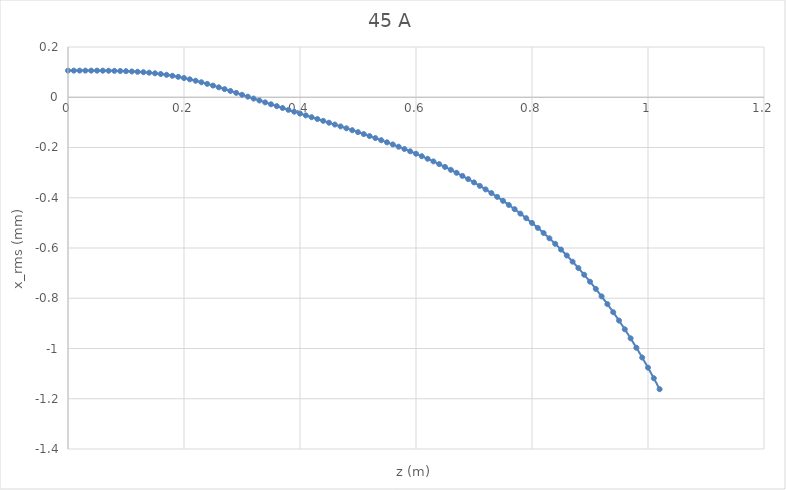
| Category | Series 0 |
|---|---|
| 0.0 | 0.106 |
| 0.01 | 0.106 |
| 0.02 | 0.106 |
| 0.03 | 0.106 |
| 0.04 | 0.106 |
| 0.05 | 0.106 |
| 0.06 | 0.106 |
| 0.07 | 0.105 |
| 0.08 | 0.105 |
| 0.09 | 0.104 |
| 0.1 | 0.104 |
| 0.11 | 0.103 |
| 0.12 | 0.101 |
| 0.13 | 0.1 |
| 0.14 | 0.098 |
| 0.15 | 0.095 |
| 0.16 | 0.093 |
| 0.17 | 0.089 |
| 0.18 | 0.085 |
| 0.19 | 0.081 |
| 0.2 | 0.077 |
| 0.21 | 0.071 |
| 0.22 | 0.066 |
| 0.23 | 0.06 |
| 0.24 | 0.053 |
| 0.25 | 0.047 |
| 0.26 | 0.04 |
| 0.27 | 0.032 |
| 0.28 | 0.025 |
| 0.29 | 0.017 |
| 0.3 | 0.01 |
| 0.31 | 0.002 |
| 0.32 | -0.005 |
| 0.33 | -0.013 |
| 0.34 | -0.02 |
| 0.35 | -0.028 |
| 0.36 | -0.035 |
| 0.37 | -0.043 |
| 0.38 | -0.05 |
| 0.39 | -0.058 |
| 0.4 | -0.065 |
| 0.41 | -0.072 |
| 0.42 | -0.079 |
| 0.43 | -0.087 |
| 0.44 | -0.094 |
| 0.45 | -0.101 |
| 0.46 | -0.109 |
| 0.47 | -0.116 |
| 0.48 | -0.124 |
| 0.49 | -0.131 |
| 0.5 | -0.139 |
| 0.51 | -0.147 |
| 0.52 | -0.155 |
| 0.53 | -0.163 |
| 0.54 | -0.171 |
| 0.55 | -0.179 |
| 0.56 | -0.188 |
| 0.57 | -0.197 |
| 0.58 | -0.206 |
| 0.59 | -0.215 |
| 0.6 | -0.225 |
| 0.61 | -0.235 |
| 0.62 | -0.245 |
| 0.63 | -0.255 |
| 0.64 | -0.266 |
| 0.65 | -0.277 |
| 0.66 | -0.289 |
| 0.67 | -0.301 |
| 0.68 | -0.313 |
| 0.69 | -0.326 |
| 0.7 | -0.339 |
| 0.71 | -0.353 |
| 0.72 | -0.367 |
| 0.73 | -0.381 |
| 0.74 | -0.397 |
| 0.75 | -0.412 |
| 0.76 | -0.429 |
| 0.77 | -0.446 |
| 0.78 | -0.463 |
| 0.79 | -0.481 |
| 0.8 | -0.5 |
| 0.81 | -0.52 |
| 0.82 | -0.54 |
| 0.83 | -0.561 |
| 0.84 | -0.583 |
| 0.85 | -0.606 |
| 0.86 | -0.63 |
| 0.87 | -0.654 |
| 0.88 | -0.68 |
| 0.89 | -0.707 |
| 0.9 | -0.734 |
| 0.91 | -0.763 |
| 0.92 | -0.792 |
| 0.93 | -0.823 |
| 0.94 | -0.855 |
| 0.95 | -0.889 |
| 0.96 | -0.924 |
| 0.97 | -0.96 |
| 0.98 | -0.997 |
| 0.99 | -1.036 |
| 1.0 | -1.076 |
| 1.01 | -1.118 |
| 1.02 | -1.162 |